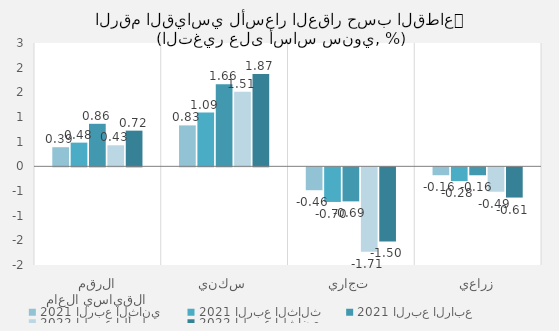
| Category | 2021 الربع الثاني | 2021 الربع الثالث | 2021 الربع الرابع | 2022 الربع الأول | 2022 الربع الثاني |
|---|---|---|---|---|---|
| الرقم القياسي العام | 0.388 | 0.481 | 0.862 | 0.427 | 0.723 |
| سكني | 0.83 | 1.09 | 1.664 | 1.509 | 1.872 |
| تجاري | -0.464 | -0.702 | -0.69 | -1.712 | -1.503 |
| زراعي | -0.16 | -0.278 | -0.161 | -0.495 | -0.613 |